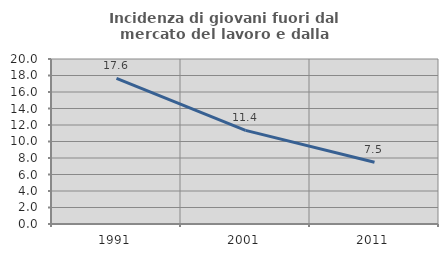
| Category | Incidenza di giovani fuori dal mercato del lavoro e dalla formazione  |
|---|---|
| 1991.0 | 17.647 |
| 2001.0 | 11.351 |
| 2011.0 | 7.483 |